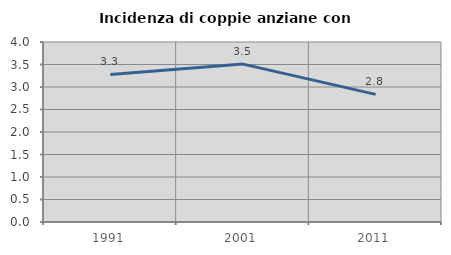
| Category | Incidenza di coppie anziane con figli |
|---|---|
| 1991.0 | 3.279 |
| 2001.0 | 3.509 |
| 2011.0 | 2.837 |